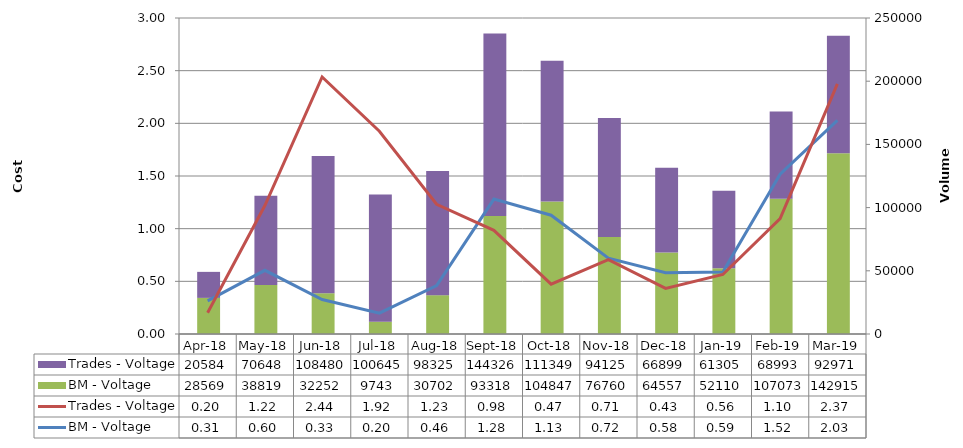
| Category | BM - Voltage | Trades - Voltage |
|---|---|---|
| 0 | 28569.236 | 20584 |
| 1900-01-01 | 38818.622 | 70647.5 |
| 1900-01-02 | 32251.668 | 108480 |
| 1900-01-03 | 9742.691 | 100644.5 |
| 1900-01-04 | 30701.911 | 98325 |
| 1900-01-05 | 93318 | 144325.5 |
| 1900-01-06 | 104846.992 | 111349 |
| 1900-01-07 | 76759.901 | 94125 |
| 1900-01-08 | 64556.966 | 66899 |
| 1900-01-09 | 52110.022 | 61305 |
| 1900-01-10 | 107073.263 | 68992.5 |
| 1900-01-11 | 142915.089 | 92970.5 |